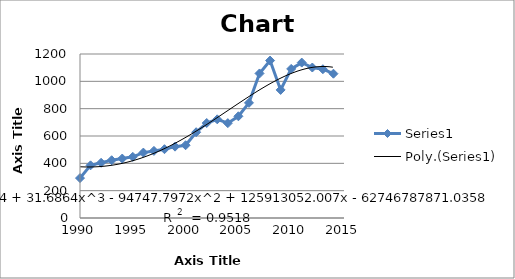
| Category | Series 0 |
|---|---|
| 1990.0 | 292.104 |
| 1991.0 | 385.329 |
| 1992.0 | 403.974 |
| 1993.0 | 422.619 |
| 1994.0 | 435.049 |
| 1995.0 | 447.479 |
| 1996.0 | 478.554 |
| 1997.0 | 490.984 |
| 1998.0 | 503.414 |
| 1999.0 | 522.059 |
| 2000.0 | 532.5 |
| 2001.0 | 627.75 |
| 2002.0 | 695 |
| 2003.0 | 722 |
| 2004.0 | 694 |
| 2005.0 | 744.25 |
| 2006.0 | 842.5 |
| 2007.0 | 1057.58 |
| 2008.0 | 1151.992 |
| 2009.0 | 937.245 |
| 2010.0 | 1090.84 |
| 2011.0 | 1137.143 |
| 2012.0 | 1101.006 |
| 2013.0 | 1088.534 |
| 2014.0 | 1055.875 |